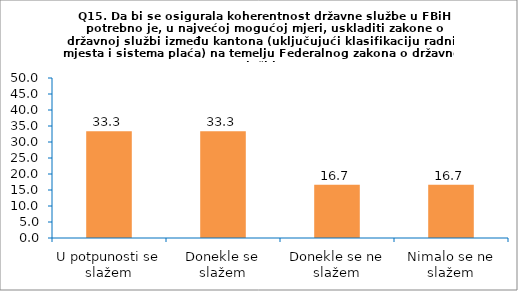
| Category | Series 0 |
|---|---|
| U potpunosti se slažem | 33.333 |
| Donekle se slažem | 33.333 |
| Donekle se ne slažem | 16.667 |
| Nimalo se ne slažem | 16.667 |